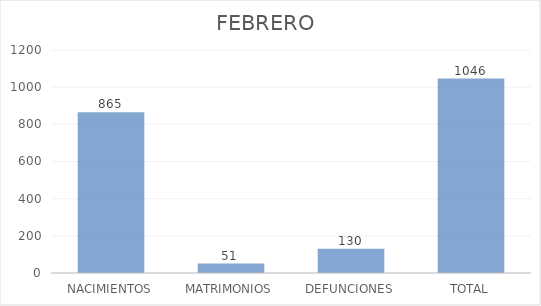
| Category | FEBRERO |
|---|---|
| NACIMIENTOS | 865 |
| MATRIMONIOS | 51 |
| DEFUNCIONES | 130 |
| TOTAL | 1046 |